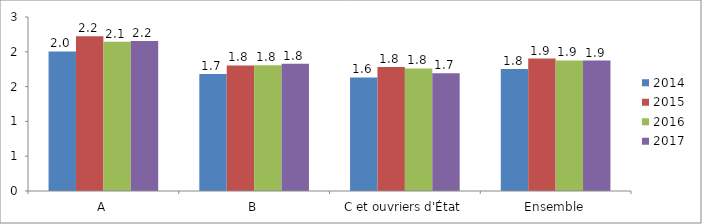
| Category | 2014 | 2015 | 2016 | 2017 |
|---|---|---|---|---|
| A | 2.006 | 2.224 | 2.146 | 2.155 |
| B | 1.682 | 1.803 | 1.808 | 1.83 |
| C et ouvriers d'État | 1.632 | 1.781 | 1.762 | 1.694 |
| Ensemble | 1.754 | 1.903 | 1.876 | 1.873 |